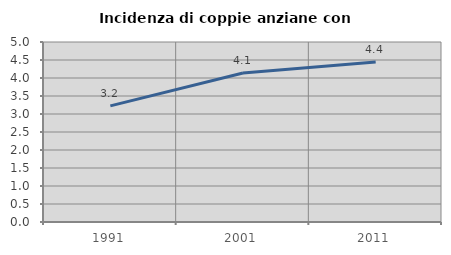
| Category | Incidenza di coppie anziane con figli |
|---|---|
| 1991.0 | 3.226 |
| 2001.0 | 4.139 |
| 2011.0 | 4.444 |